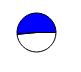
| Category | Series 0 |
|---|---|
| 0 | 42189 |
| 1 | 44811 |